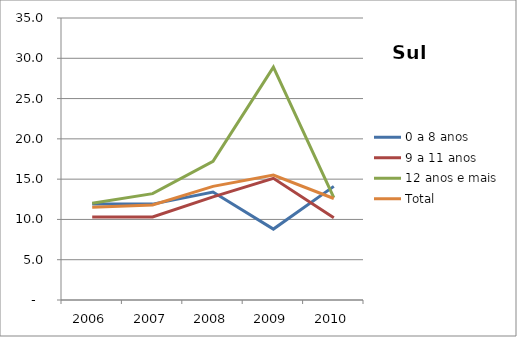
| Category | 0 a 8 anos | 9 a 11 anos | 12 anos e mais | Total |
|---|---|---|---|---|
| 2006.0 | 11.9 | 10.3 | 12 | 11.5 |
| 2007.0 | 11.9 | 10.3 | 13.2 | 11.8 |
| 2008.0 | 13.4 | 12.8 | 17.2 | 14.1 |
| 2009.0 | 8.8 | 15.1 | 28.9 | 15.5 |
| 2010.0 | 14.1 | 10.2 | 12.7 | 12.6 |